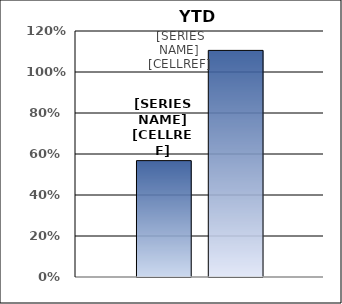
| Category | Expenditures | Annual Energy Savings |
|---|---|---|
| 0 | 0.568 | 1.105 |